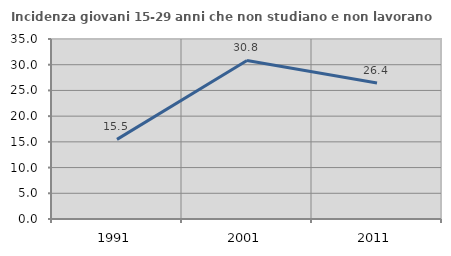
| Category | Incidenza giovani 15-29 anni che non studiano e non lavorano  |
|---|---|
| 1991.0 | 15.484 |
| 2001.0 | 30.824 |
| 2011.0 | 26.442 |